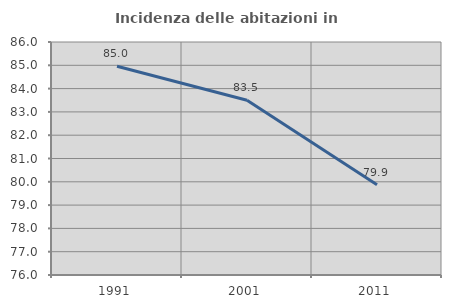
| Category | Incidenza delle abitazioni in proprietà  |
|---|---|
| 1991.0 | 84.958 |
| 2001.0 | 83.5 |
| 2011.0 | 79.871 |